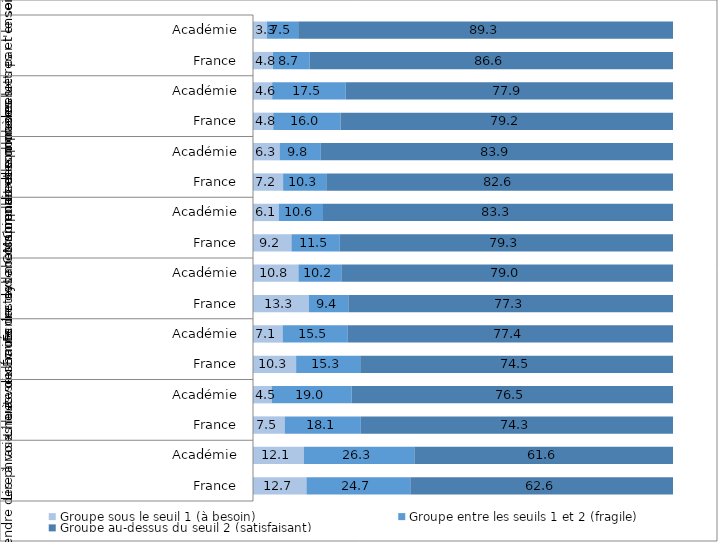
| Category | Groupe sous le seuil 1 (à besoin) | Groupe entre les seuils 1 et 2 (fragile) | Groupe au-dessus du seuil 2 (satisfaisant) |
|---|---|---|---|
| 0 | 12.733 | 24.733 | 62.567 |
| 1 | 12.083 | 26.333 | 61.583 |
| 2 | 7.533 | 18.133 | 74.317 |
| 3 | 4.483 | 19 | 76.517 |
| 4 | 10.267 | 15.267 | 74.483 |
| 5 | 7.05 | 15.533 | 77.417 |
| 6 | 13.3 | 9.4 | 77.283 |
| 7 | 10.817 | 10.217 | 78.967 |
| 8 | 9.15 | 11.517 | 79.333 |
| 9 | 6.117 | 10.55 | 83.333 |
| 10 | 7.167 | 10.283 | 82.567 |
| 11 | 6.333 | 9.817 | 83.867 |
| 12 | 4.817 | 16.033 | 79.183 |
| 13 | 4.567 | 17.517 | 77.9 |
| 14 | 4.75 | 8.717 | 86.55 |
| 15 | 3.283 | 7.483 | 89.25 |